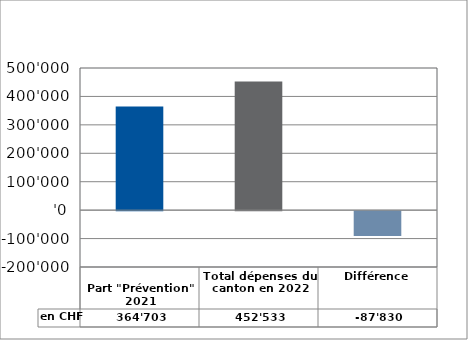
| Category | en CHF |
|---|---|
| 
Part "Prévention" 2021

 | 364703 |
| Total dépenses du canton en 2022 | 452533 |
| Différence | -87830 |